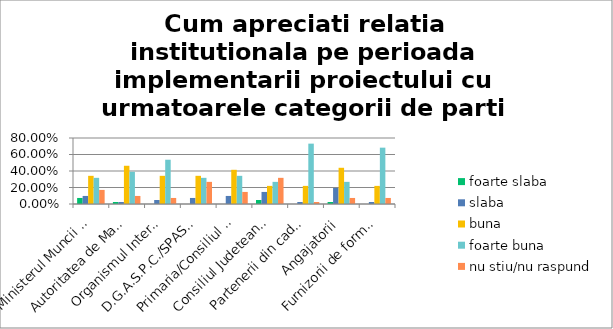
| Category | foarte slaba | slaba | buna | foarte buna | nu stiu/nu raspund |
|---|---|---|---|---|---|
| Ministerul Muncii si Protectiei Sociale (MMPS) | 0.073 | 0.098 | 0.342 | 0.317 | 0.171 |
| Autoritatea de Management pentru POCU (AM POCU) | 0.024 | 0.024 | 0.463 | 0.39 | 0.098 |
| Organismul Intermediar Regional pentru POCU (OIR POCU) | 0 | 0.049 | 0.342 | 0.537 | 0.073 |
| D.G.A.S.P.C./SPAS din locatia/locatiile de implementare | 0 | 0.073 | 0.342 | 0.317 | 0.268 |
| Primaria/Consiliul Local din locatia/locatiile de implementare | 0 | 0.098 | 0.415 | 0.342 | 0.146 |
| Consiliul Judetean din locatia/locatiile de implementare | 0.049 | 0.146 | 0.22 | 0.268 | 0.317 |
| Partenerii din cadrul proiectului | 0 | 0.024 | 0.22 | 0.732 | 0.024 |
| Angajatorii | 0.024 | 0.195 | 0.439 | 0.268 | 0.073 |
| Furnizorii de formare profesională | 0 | 0.024 | 0.22 | 0.683 | 0.073 |